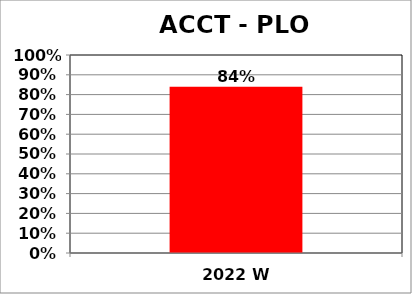
| Category | Series 0 |
|---|---|
| 2022 W | 0.84 |